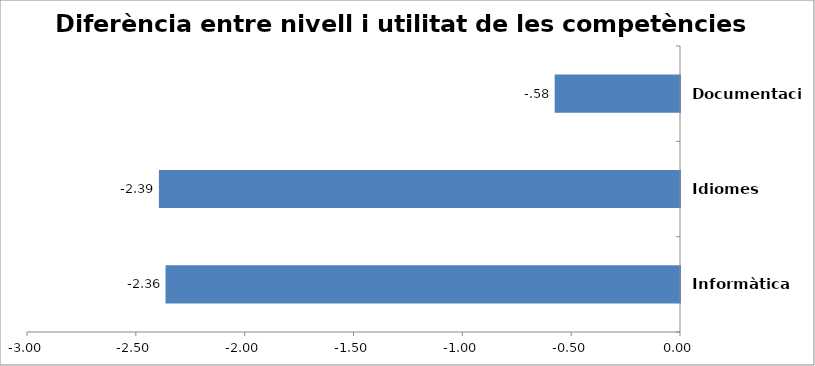
| Category | ARQUITECTURA |
|---|---|
| Informàtica | -2.364 |
| Idiomes | -2.394 |
| Documentació | -0.576 |